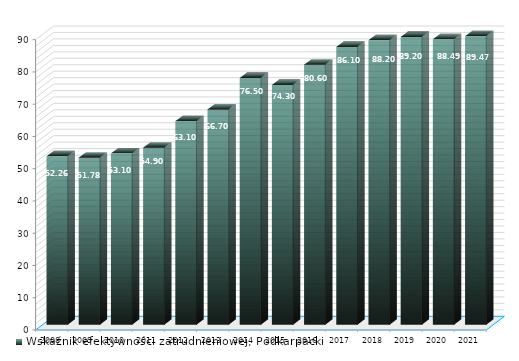
| Category | Wskaźnik efektywności zatrudnieniowej, Podkarpackie |
|---|---|
| 2008.0 | 52.26 |
| 2009.0 | 51.78 |
| 2010.0 | 53.1 |
| 2011.0 | 54.9 |
| 2012.0 | 63.1 |
| 2013.0 | 66.7 |
| 2014.0 | 76.5 |
| 2015.0 | 74.3 |
| 2016.0 | 80.6 |
| 2017.0 | 86.1 |
| 2018.0 | 88.2 |
| 2019.0 | 89.2 |
| 2020.0 | 88.495 |
| 2021.0 | 89.471 |